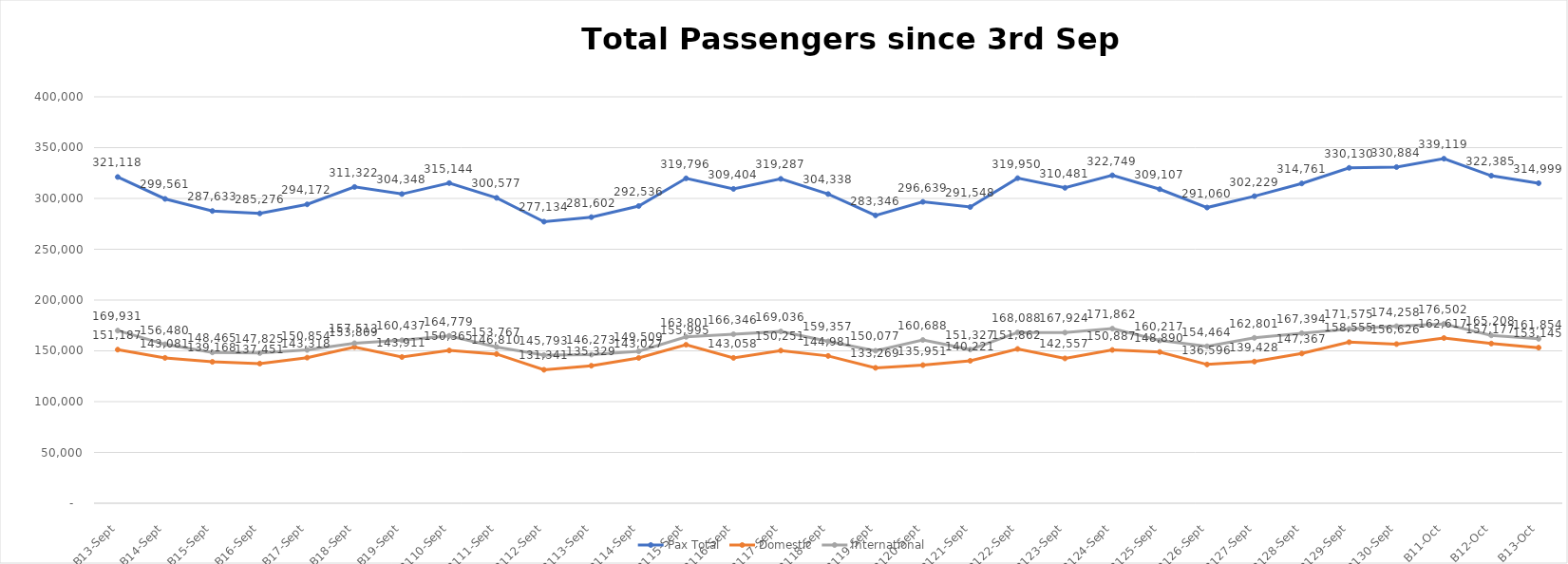
| Category | Pax Total | Domestic | International |
|---|---|---|---|
| 2023-09-03 | 321118 | 151187 | 169931 |
| 2023-09-04 | 299561 | 143081 | 156480 |
| 2023-09-05 | 287633 | 139168 | 148465 |
| 2023-09-06 | 285276 | 137451 | 147825 |
| 2023-09-07 | 294172 | 143318 | 150854 |
| 2023-09-08 | 311322 | 153809 | 157513 |
| 2023-09-09 | 304348 | 143911 | 160437 |
| 2023-09-10 | 315144 | 150365 | 164779 |
| 2023-09-11 | 300577 | 146810 | 153767 |
| 2023-09-12 | 277134 | 131341 | 145793 |
| 2023-09-13 | 281602 | 135329 | 146273 |
| 2023-09-14 | 292536 | 143027 | 149509 |
| 2023-09-15 | 319796 | 155995 | 163801 |
| 2023-09-16 | 309404 | 143058 | 166346 |
| 2023-09-17 | 319287 | 150251 | 169036 |
| 2023-09-18 | 304338 | 144981 | 159357 |
| 2023-09-19 | 283346 | 133269 | 150077 |
| 2023-09-20 | 296639 | 135951 | 160688 |
| 2023-09-21 | 291548 | 140221 | 151327 |
| 2023-09-22 | 319950 | 151862 | 168088 |
| 2023-09-23 | 310481 | 142557 | 167924 |
| 2023-09-24 | 322749 | 150887 | 171862 |
| 2023-09-25 | 309107 | 148890 | 160217 |
| 2023-09-26 | 291060 | 136596 | 154464 |
| 2023-09-27 | 302229 | 139428 | 162801 |
| 2023-09-28 | 314761 | 147367 | 167394 |
| 2023-09-29 | 330130 | 158555 | 171575 |
| 2023-09-30 | 330884 | 156626 | 174258 |
| 2023-10-01 | 339119 | 162617 | 176502 |
| 2023-10-02 | 322385 | 157177 | 165208 |
| 2023-10-03 | 314999 | 153145 | 161854 |